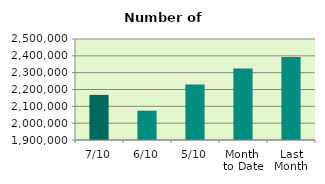
| Category | Series 0 |
|---|---|
| 7/10 | 2167936 |
| 6/10 | 2074178 |
| 5/10 | 2229550 |
| Month 
to Date | 2325312.4 |
| Last
Month | 2392468.182 |